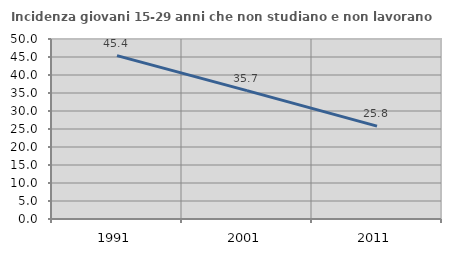
| Category | Incidenza giovani 15-29 anni che non studiano e non lavorano  |
|---|---|
| 1991.0 | 45.38 |
| 2001.0 | 35.66 |
| 2011.0 | 25.799 |